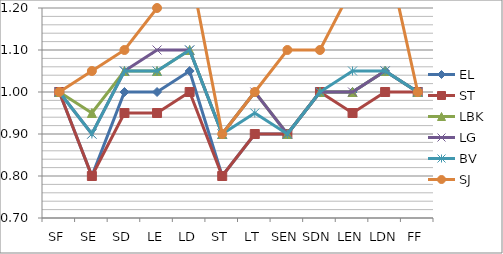
| Category | EL | ST | LBK | LG | BV | SJ |
|---|---|---|---|---|---|---|
| SF | 1 | 1 | 1 | 1 | 1 | 1 |
| SE | 0.8 | 0.8 | 0.95 | 0.9 | 0.9 | 1.05 |
| SD | 1 | 0.95 | 1.05 | 1.05 | 1.05 | 1.1 |
| LE | 1 | 0.95 | 1.05 | 1.1 | 1.05 | 1.2 |
| LD | 1.05 | 1 | 1.1 | 1.1 | 1.1 | 1.3 |
| ST | 0.8 | 0.8 | 0.9 | 0.9 | 0.9 | 0.9 |
| LT | 0.9 | 0.9 | 1 | 1 | 0.95 | 1 |
| SEN | 0.9 | 0.9 | 0.9 | 0.9 | 0.9 | 1.1 |
| SDN | 1 | 1 | 1 | 1 | 1 | 1.1 |
| LEN | 1 | 0.95 | 1 | 1 | 1.05 | 1.25 |
| LDN | 1.05 | 1 | 1.05 | 1.05 | 1.05 | 1.35 |
| FF | 1 | 1 | 1 | 1 | 1 | 1 |